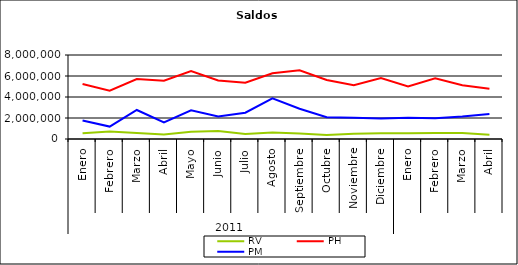
| Category | RV | PH | PM |
|---|---|---|---|
| 0 | 546670.212 | 5240387.217 | 1770507.251 |
| 1 | 715536.358 | 4593171.506 | 1181312.523 |
| 2 | 568564.534 | 5710312.033 | 2762033.878 |
| 3 | 426747.887 | 5549570.842 | 1587442.55 |
| 4 | 686271.822 | 6476363.299 | 2727303.716 |
| 5 | 762477.489 | 5573523.825 | 2135729.795 |
| 6 | 485149.599 | 5351177.842 | 2503765.107 |
| 7 | 619491.054 | 6263322.438 | 3865525.639 |
| 8 | 533686.166 | 6549487.056 | 2883830.136 |
| 9 | 387120.447 | 5613301.291 | 2081405.529 |
| 10 | 490994.259 | 5113591.729 | 2024741.733 |
| 11 | 549111.197 | 5800732.143 | 1961516.87 |
| 12 | 549778.168 | 5006132.96 | 2027838.04 |
| 13 | 570527.999 | 5771155.703 | 1979807.811 |
| 14 | 560604.832 | 5123876.98 | 2144060.858 |
| 15 | 406794.423 | 4795437.398 | 2380409.171 |